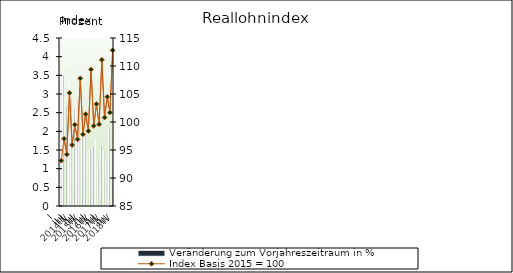
| Category | Veränderung zum Vorjahreszeitraum in % |
|---|---|
| 0 | 4.3 |
| 1 | 3.5 |
| 2 | 2.7 |
| 3 | 3.6 |
| 4 | 2.9 |
| 5 | 2.6 |
| 6 | 2.9 |
| 7 | 2.4 |
| 8 | 2 |
| 9 | 1.9 |
| 10 | 1.5 |
| 11 | 1.5 |
| 12 | 1.6 |
| 13 | 1.8 |
| 14 | 1.2 |
| 15 | 1.6 |
| 16 | 1.5 |
| 17 | 1.3 |
| 18 | 2.1 |
| 19 | 1.5 |